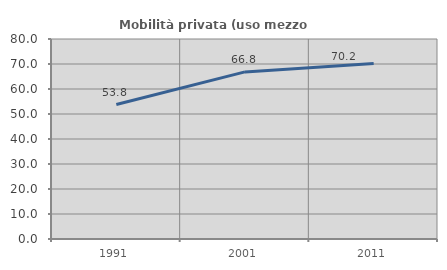
| Category | Mobilità privata (uso mezzo privato) |
|---|---|
| 1991.0 | 53.787 |
| 2001.0 | 66.836 |
| 2011.0 | 70.21 |